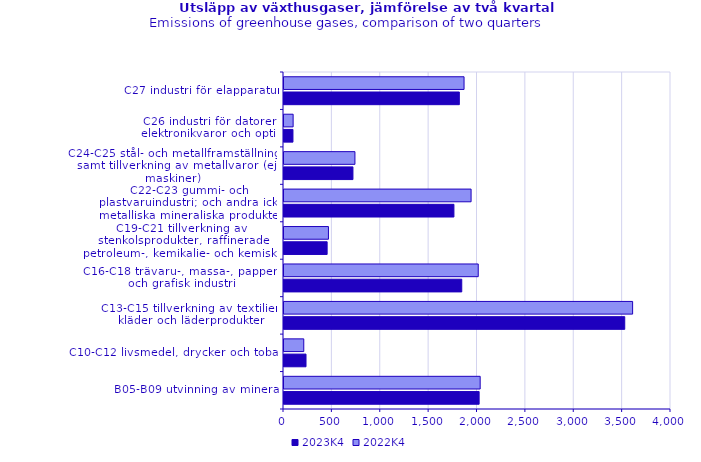
| Category | 2023K4 | 2022K4 |
|---|---|---|
| B05-B09 utvinning av mineral | 2016.844 | 2027.707 |
| C10-C12 livsmedel, drycker och tobak | 227.619 | 204.371 |
| C13-C15 tillverkning av textilier, kläder och läderprodukter | 3521.81 | 3603.312 |
| C16-C18 trävaru-, massa-, pappers- och grafisk industri | 1837.356 | 2007.651 |
| C19-C21 tillverkning av stenkolsprodukter, raffinerade petroleum-, kemikalie- och kemiska produkter samt av farmaceutiska basprodukter och läkemedel | 445.891 | 459.435 |
| C22-C23 gummi- och plastvaruindustri; och andra icke metalliska mineraliska produkter | 1756.32 | 1933.681 |
| C24-C25 stål- och metallframställning; samt tillverkning av metallvaror (ej maskiner) | 712.652 | 733.112 |
| C26 industri för datorer, elektronikvaror och optik | 92.623 | 94.361 |
| C27 industri för elapparatur | 1812.299 | 1861.073 |